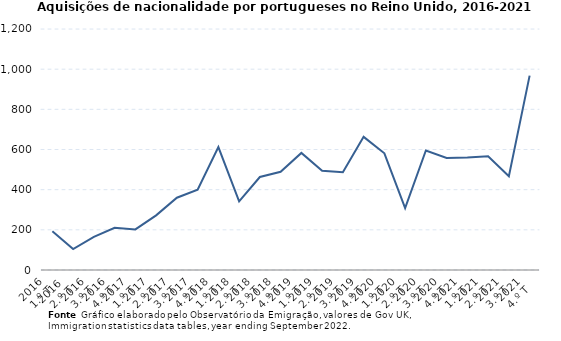
| Category | Series 0 |
|---|---|
| 2016
1.º T | 193 |
| 2016 
2.º T | 104 |
| 2016
3.º T | 165 |
| 2016
4.º T | 210 |
| 2017
1.º T | 202 |
| 2017
2.º T | 272 |
| 2017
3.º T | 360 |
| 2017
4.º T | 400 |
| 2018
1.º T | 612 |
| 2018
2.º T | 342 |
| 2018
3.º T | 463 |
| 2018
4.º T | 489 |
| 2019
1.º T | 583 |
| 2019
2.º T | 494 |
| 2019
3.º T | 487 |
| 2019
4.º T | 663 |
| 2020
1.º T | 581 |
| 2020
2.º T | 308 |
| 2020
3.º T | 595 |
| 2020
4.º T | 558 |
| 2021
1.º T | 560 |
| 2021
2.º T | 566 |
| 2021
3.º T | 467 |
| 2021
4.º T | 968 |